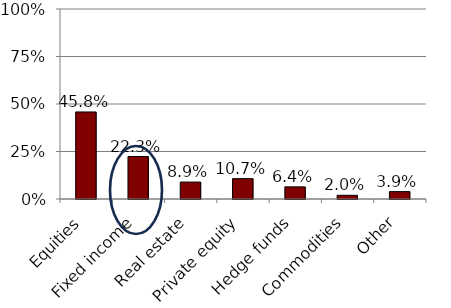
| Category | Series 1 |
|---|---|
| Equities | 0.458 |
| Fixed income | 0.223 |
| Real estate | 0.089 |
| Private equity | 0.107 |
| Hedge funds | 0.064 |
| Commodities | 0.02 |
| Other | 0.039 |